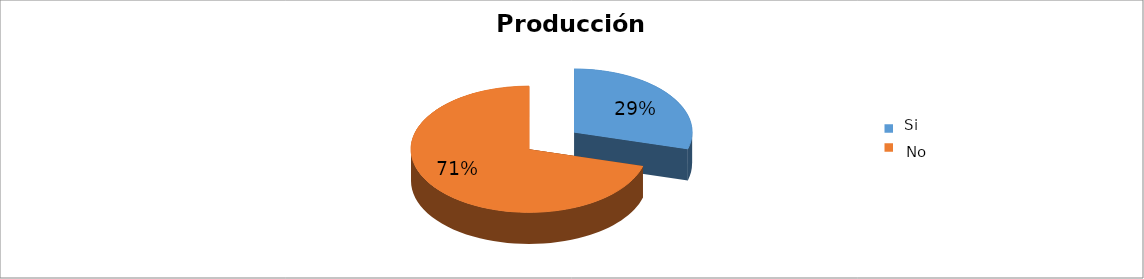
| Category | Series 0 |
|---|---|
| 0 | 0.293 |
| 1 | 0.707 |